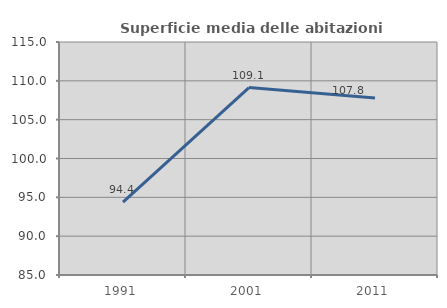
| Category | Superficie media delle abitazioni occupate |
|---|---|
| 1991.0 | 94.374 |
| 2001.0 | 109.129 |
| 2011.0 | 107.781 |